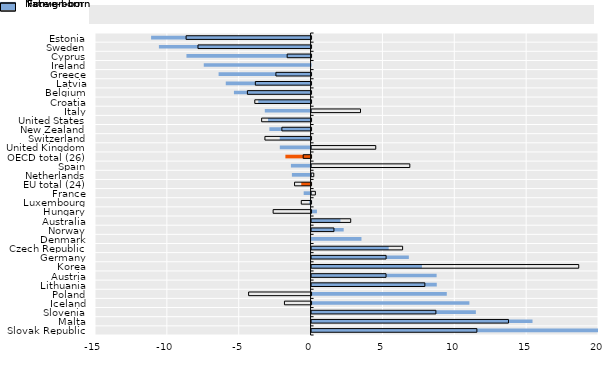
| Category | Foreign-born | Native-born |
|---|---|---|
| Estonia | -11.097 | -8.697 |
| Sweden | -10.553 | -7.869 |
| Cyprus | -8.637 | -1.663 |
| Ireland | -7.432 | 0 |
| Greece | -6.4 | -2.448 |
| Latvia | -5.901 | -3.878 |
| Belgium | -5.333 | -4.431 |
| Croatia | -3.641 | -3.916 |
| Italy | -3.185 | 3.405 |
| United States | -2.96 | -3.44 |
| New Zealand | -2.866 | -2.033 |
| Switzerland | -2.145 | -3.212 |
| United Kingdom | -2.14 | 4.466 |
| OECD total (26) | -1.752 | -0.549 |
| Spain | -1.367 | 6.836 |
| Netherlands | -1.3 | 0.153 |
| EU total (24) | -0.648 | -1.149 |
| France | -0.48 | 0.266 |
| Luxembourg | -0.086 | -0.682 |
| Hungary | 0.373 | -2.639 |
| Australia | 2.007 | 2.723 |
| Norway | 2.235 | 1.555 |
| Denmark | 3.471 | 0 |
| Czech Republic | 5.366 | 6.335 |
| Germany | 6.769 | 5.185 |
| Korea | 7.681 | 18.591 |
| Austria | 8.702 | 5.182 |
| Lithuania | 8.712 | 7.882 |
| Poland | 9.409 | -4.347 |
| Iceland | 10.981 | -1.852 |
| Slovenia | 11.433 | 8.65 |
| Malta | 15.374 | 13.7 |
| Slovak Republic | 21.006 | 11.502 |